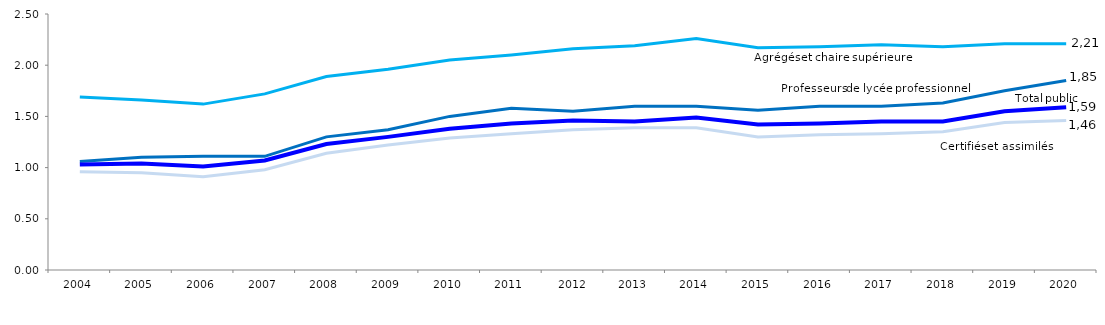
| Category | Agrégés et chaire supérieure | Certifiés et assimilés | Professeurs de lycée professionnel | Total secteur public |
|---|---|---|---|---|
| 2004 | 1.69 | 0.96 | 1.06 | 1.03 |
| 2005 | 1.66 | 0.95 | 1.1 | 1.04 |
| 2006 | 1.62 | 0.91 | 1.11 | 1.01 |
| 2007 | 1.72 | 0.98 | 1.11 | 1.07 |
| 2008 | 1.89 | 1.14 | 1.3 | 1.23 |
| 2009 | 1.96 | 1.22 | 1.37 | 1.3 |
| 2010 | 2.05 | 1.29 | 1.5 | 1.38 |
| 2011 | 2.1 | 1.33 | 1.58 | 1.43 |
| 2012
 | 2.16 | 1.37 | 1.55 | 1.46 |
| 2013 | 2.19 | 1.39 | 1.6 | 1.45 |
| 2014 | 2.26 | 1.39 | 1.6 | 1.49 |
| 2015 | 2.17 | 1.3 | 1.56 | 1.42 |
| 2016 | 2.18 | 1.32 | 1.6 | 1.43 |
| 2017 | 2.2 | 1.33 | 1.6 | 1.45 |
| 2018 | 2.18 | 1.35 | 1.63 | 1.45 |
| 2019 | 2.21 | 1.44 | 1.75 | 1.55 |
| 2020 | 2.21 | 1.46 | 1.85 | 1.59 |